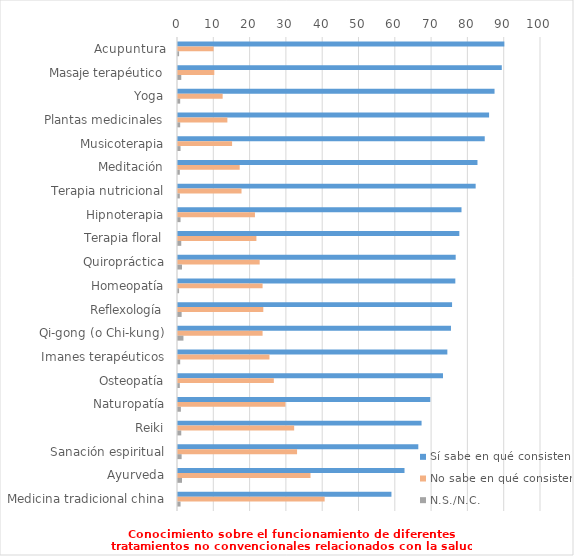
| Category | Sí sabe en qué consisten | No sabe en qué consisten | N.S./N.C. |
|---|---|---|---|
| Acupuntura | 89.9 | 9.8 | 0.3 |
| Masaje terapéutico | 89.2 | 10 | 0.9 |
| Yoga | 87.2 | 12.3 | 0.6 |
| Plantas medicinales | 85.7 | 13.6 | 0.6 |
| Musicoterapia | 84.5 | 14.9 | 0.7 |
| Meditación | 82.5 | 17 | 0.5 |
| Terapia nutricional | 82 | 17.5 | 0.5 |
| Hipnoterapia | 78.1 | 21.2 | 0.7 |
| Terapia floral | 77.5 | 21.6 | 0.9 |
| Quiropráctica | 76.5 | 22.5 | 1.1 |
| Homeopatía | 76.4 | 23.3 | 0.3 |
| Reflexología | 75.5 | 23.5 | 1 |
| Qi-gong (o Chi-kung) | 75.2 | 23.3 | 1.5 |
| Imanes terapéuticos | 74.2 | 25.2 | 0.6 |
| Osteopatía | 73 | 26.4 | 0.5 |
| Naturopatía | 69.5 | 29.6 | 0.8 |
| Reiki | 67.1 | 32 | 0.9 |
| Sanación espiritual | 66.2 | 32.8 | 1 |
| Ayurveda | 62.4 | 36.5 | 1.1 |
| Medicina tradicional china | 58.8 | 40.4 | 0.7 |